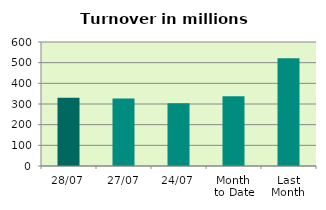
| Category | Series 0 |
|---|---|
| 28/07 | 330.029 |
| 27/07 | 326.823 |
| 24/07 | 304.09 |
| Month 
to Date | 337.892 |
| Last
Month | 521.023 |